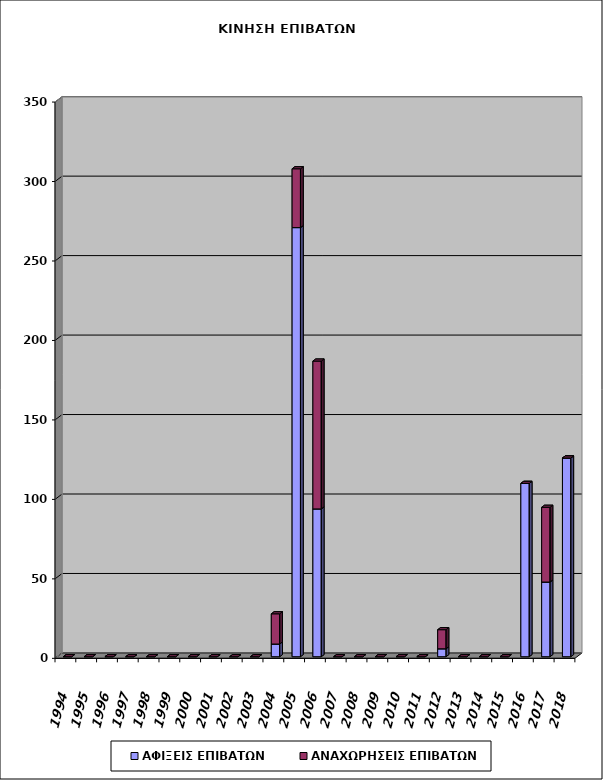
| Category | ΑΦΙΞΕΙΣ ΕΠΙΒΑΤΩΝ | ΑΝΑΧΩΡΗΣΕΙΣ ΕΠΙΒΑΤΩΝ |
|---|---|---|
| 1994.0 | 0 | 0 |
| 1995.0 | 0 | 0 |
| 1996.0 | 0 | 0 |
| 1997.0 | 0 | 0 |
| 1998.0 | 0 | 0 |
| 1999.0 | 0 | 0 |
| 2000.0 | 0 | 0 |
| 2001.0 | 0 | 0 |
| 2002.0 | 0 | 0 |
| 2003.0 | 0 | 0 |
| 2004.0 | 8 | 19 |
| 2005.0 | 270 | 37 |
| 2006.0 | 93 | 93 |
| 2007.0 | 0 | 0 |
| 2008.0 | 0 | 0 |
| 2009.0 | 0 | 0 |
| 2010.0 | 0 | 0 |
| 2011.0 | 0 | 0 |
| 2012.0 | 5 | 12 |
| 2013.0 | 0 | 0 |
| 2014.0 | 0 | 0 |
| 2015.0 | 0 | 0 |
| 2016.0 | 109 | 0 |
| 2017.0 | 47 | 47 |
| 2018.0 | 125 | 0 |